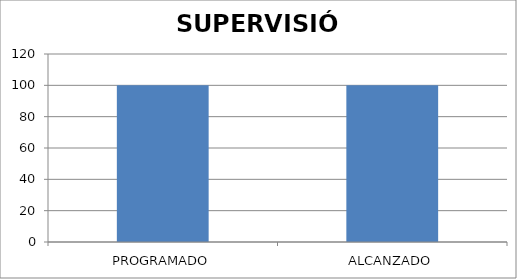
| Category | SUPERVISIÓN |
|---|---|
| PROGRAMADO | 100 |
| ALCANZADO | 100 |